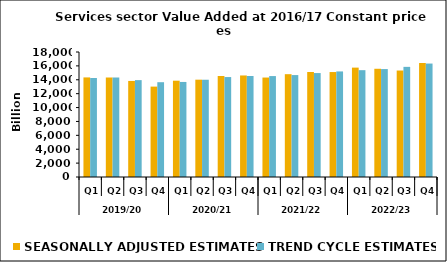
| Category | SEASONALLY ADJUSTED ESTIMATES | TREND CYCLE ESTIMATES |
|---|---|---|
| 0 | 14340.018 | 14255.35 |
| 1 | 14327.242 | 14327.583 |
| 2 | 13831.716 | 13951.218 |
| 3 | 13016.654 | 13650.555 |
| 4 | 13867.836 | 13686.49 |
| 5 | 14015.19 | 14005.654 |
| 6 | 14543.078 | 14391.759 |
| 7 | 14620.944 | 14547.785 |
| 8 | 14322.199 | 14534.599 |
| 9 | 14805.407 | 14677.909 |
| 10 | 15118.948 | 14968.343 |
| 11 | 15113.433 | 15201.803 |
| 12 | 15751.281 | 15383.22 |
| 13 | 15585.088 | 15541.584 |
| 14 | 15332.009 | 15860.21 |
| 15 | 16414.818 | 16336.484 |